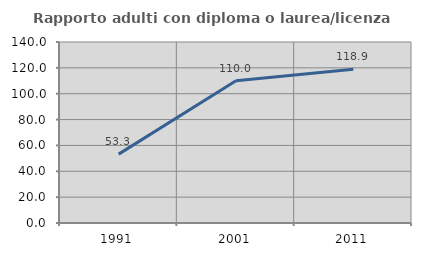
| Category | Rapporto adulti con diploma o laurea/licenza media  |
|---|---|
| 1991.0 | 53.261 |
| 2001.0 | 110 |
| 2011.0 | 118.939 |